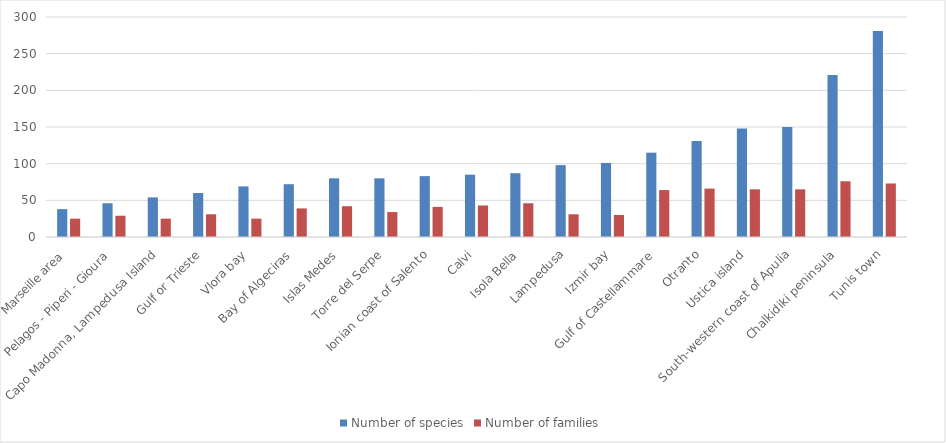
| Category | Number of species | Number of families |
|---|---|---|
| Marseille area | 38 | 25 |
| Pelagos - Piperi - Gioura | 46 | 29 |
| Capo Madonna, Lampedusa Island | 54 | 25 |
| Gulf or Trieste | 60 | 31 |
| Vlora bay | 69 | 25 |
| Bay of Algeciras | 72 | 39 |
| Islas Medes | 80 | 42 |
| Torre del Serpe | 80 | 34 |
| Ionian coast of Salento | 83 | 41 |
| Calvi | 85 | 43 |
| Isola Bella | 87 | 46 |
| Lampedusa | 98 | 31 |
| Izmir bay | 101 | 30 |
|  Gulf of Castellammare | 115 | 64 |
| Otranto | 131 | 66 |
| Ustica island | 148 | 65 |
| South-western coast of Apulia | 150 | 65 |
| Chalkidiki peninsula | 221 | 76 |
| Tunis town | 281 | 73 |